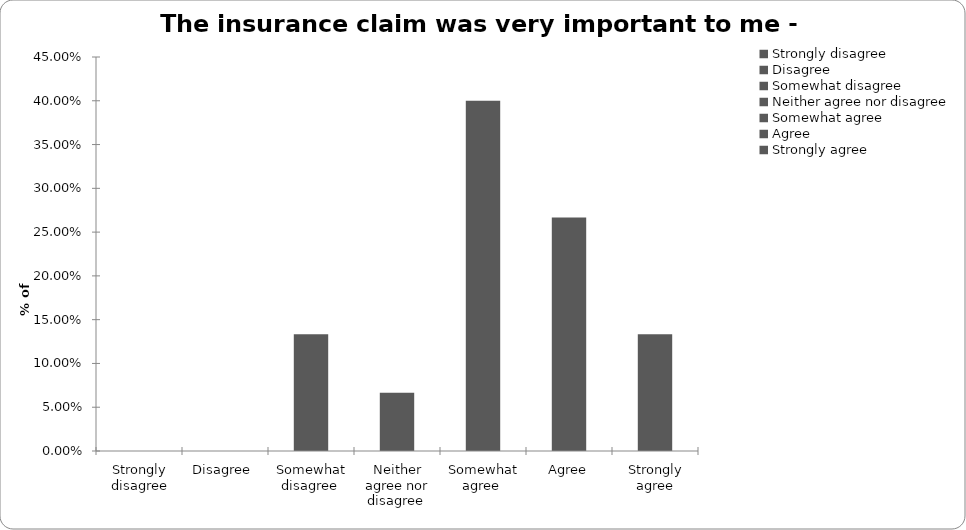
| Category | Series 2 |
|---|---|
| Strongly disagree | 0 |
| Disagree  | 0 |
| Somewhat disagree  | 0.133 |
| Neither agree nor disagree  | 0.067 |
| Somewhat agree  | 0.4 |
| Agree | 0.267 |
| Strongly agree | 0.133 |